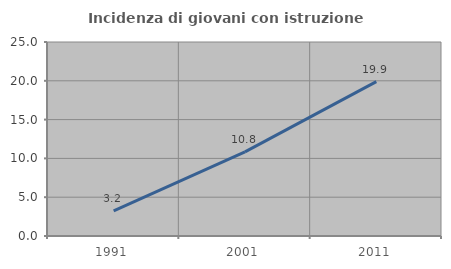
| Category | Incidenza di giovani con istruzione universitaria |
|---|---|
| 1991.0 | 3.247 |
| 2001.0 | 10.849 |
| 2011.0 | 19.89 |